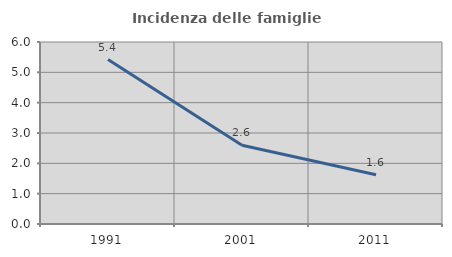
| Category | Incidenza delle famiglie numerose |
|---|---|
| 1991.0 | 5.42 |
| 2001.0 | 2.595 |
| 2011.0 | 1.624 |